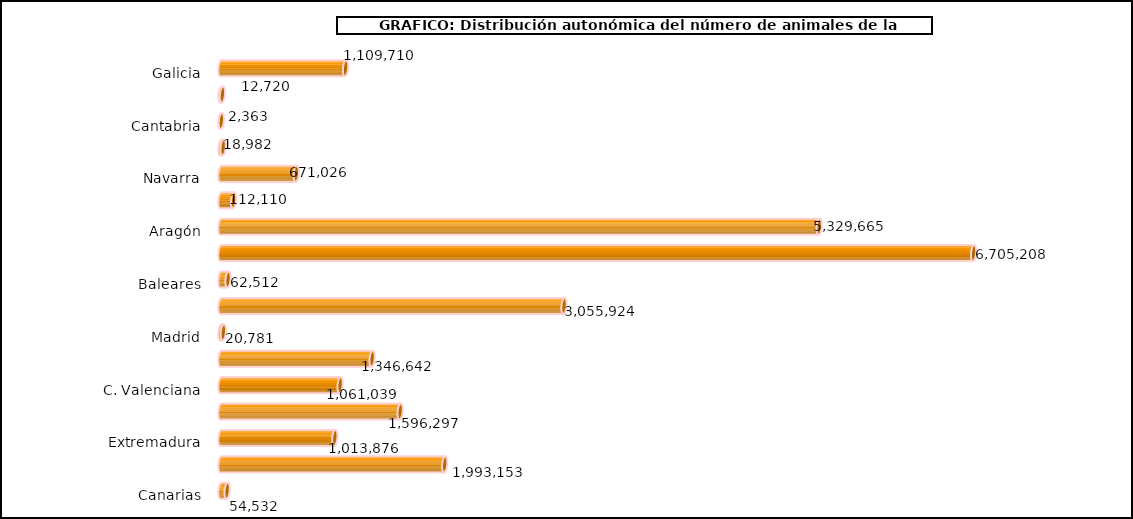
| Category | num. Animales |
|---|---|
|   Galicia | 1109710 |
|   P. de Asturias | 12720 |
|   Cantabria | 2363 |
|   País Vasco | 18982 |
|   Navarra | 671026 |
|   La Rioja | 112110 |
|   Aragón | 5329665 |
|   Cataluña | 6705208 |
|   Baleares | 62512 |
|   Castilla y León | 3055924 |
|   Madrid | 20781 |
|   Castilla – La Mancha | 1346642 |
|   C. Valenciana | 1061039 |
|   R. de Murcia | 1596297 |
|   Extremadura | 1013876 |
|   Andalucía | 1993153 |
|   Canarias | 54532 |